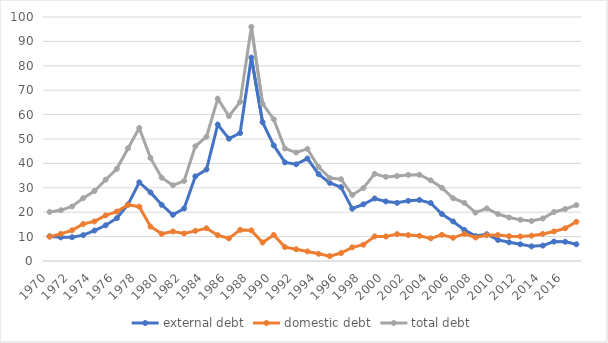
| Category | external debt | domestic debt | total debt |
|---|---|---|---|
| 1970.0 | 10.104 | 9.994 | 20.098 |
| 1971.0 | 9.697 | 11.109 | 20.805 |
| 1972.0 | 9.726 | 12.605 | 22.331 |
| 1973.0 | 10.6 | 15.166 | 25.766 |
| 1974.0 | 12.466 | 16.211 | 28.677 |
| 1975.0 | 14.639 | 18.688 | 33.327 |
| 1976.0 | 17.548 | 20.24 | 37.787 |
| 1977.0 | 23.198 | 23.03 | 46.229 |
| 1978.0 | 32.25 | 22.265 | 54.514 |
| 1979.0 | 28.109 | 14.114 | 42.223 |
| 1980.0 | 23.03 | 11.136 | 34.165 |
| 1981.0 | 18.922 | 12.112 | 31.034 |
| 1982.0 | 21.521 | 11.291 | 32.812 |
| 1983.0 | 34.677 | 12.355 | 47.032 |
| 1984.0 | 37.517 | 13.42 | 50.937 |
| 1985.0 | 55.905 | 10.585 | 66.49 |
| 1986.0 | 50.13 | 9.267 | 59.396 |
| 1987.0 | 52.444 | 12.754 | 65.198 |
| 1988.0 | 83.383 | 12.557 | 95.94 |
| 1989.0 | 56.884 | 7.574 | 64.458 |
| 1990.0 | 47.359 | 10.668 | 58.026 |
| 1991.0 | 40.408 | 5.696 | 46.104 |
| 1992.0 | 39.641 | 4.809 | 44.451 |
| 1993.0 | 41.991 | 3.933 | 45.924 |
| 1994.0 | 35.579 | 2.955 | 38.535 |
| 1995.0 | 31.985 | 2.002 | 33.988 |
| 1996.0 | 30.261 | 3.255 | 33.515 |
| 1997.0 | 21.429 | 5.609 | 27.038 |
| 1998.0 | 23.253 | 6.682 | 29.935 |
| 1999.0 | 25.624 | 10.087 | 35.71 |
| 2000.0 | 24.421 | 10.056 | 34.476 |
| 2001.0 | 23.832 | 11.008 | 34.84 |
| 2002.0 | 24.668 | 10.618 | 35.286 |
| 2003.0 | 25.003 | 10.337 | 35.34 |
| 2004.0 | 23.78 | 9.285 | 33.065 |
| 2005.0 | 19.27 | 10.733 | 30.003 |
| 2006.0 | 16.211 | 9.511 | 25.722 |
| 2007.0 | 12.741 | 11.108 | 23.85 |
| 2008.0 | 10.215 | 9.617 | 19.833 |
| 2009.0 | 10.957 | 10.581 | 21.538 |
| 2010.0 | 8.638 | 10.628 | 19.266 |
| 2011.0 | 7.648 | 10.185 | 17.833 |
| 2012.0 | 6.843 | 10.058 | 16.901 |
| 2013.0 | 6.001 | 10.38 | 16.381 |
| 2014.0 | 6.311 | 11.103 | 17.413 |
| 2015.0 | 7.966 | 12.117 | 20.083 |
| 2016.0 | 7.886 | 13.423 | 21.309 |
| 2017.0 | 6.844 | 16.066 | 22.91 |